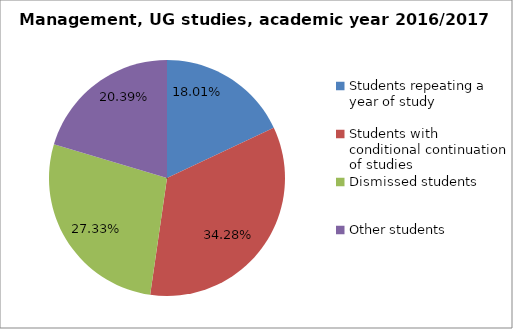
| Category | Series 0 |
|---|---|
| Students repeating a year of study | 83 |
| Students with conditional continuation of studies | 158 |
| Dismissed students | 126 |
| Other students | 94 |